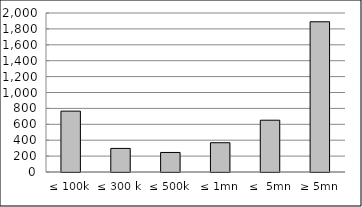
| Category | Series 0 |
|---|---|
| ≤ 100k | 765598956.771 |
| ≤ 300 k | 296747467.266 |
| ≤ 500k | 245792987.97 |
| ≤ 1mn | 368242816.77 |
| ≤  5mn | 651384553.801 |
| ≥ 5mn | 1889602308.36 |